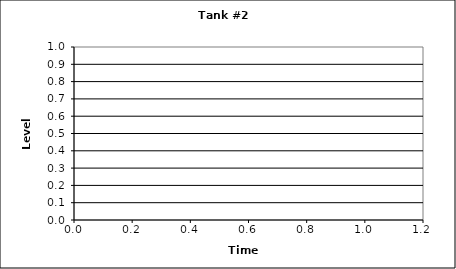
| Category | Series 0 |
|---|---|
| 0 | 0 |
| 1 | 0 |
| 2 | 0 |
| 3 | 0 |
| 4 | 0 |
| 5 | 0 |
| 6 | 0 |
| 7 | 0 |
| 8 | 0 |
| 9 | 0 |
| 10 | 0 |
| 11 | 0 |
| 12 | 0 |
| 13 | 0 |
| 14 | 0 |
| 15 | 0 |
| 16 | 0 |
| 17 | 0 |
| 18 | 0 |
| 19 | 0 |
| 20 | 0 |
| 21 | 0 |
| 22 | 0 |
| 23 | 0 |
| 24 | 0 |
| 25 | 0 |
| 26 | 0 |
| 27 | 0 |
| 28 | 0 |
| 29 | 0 |